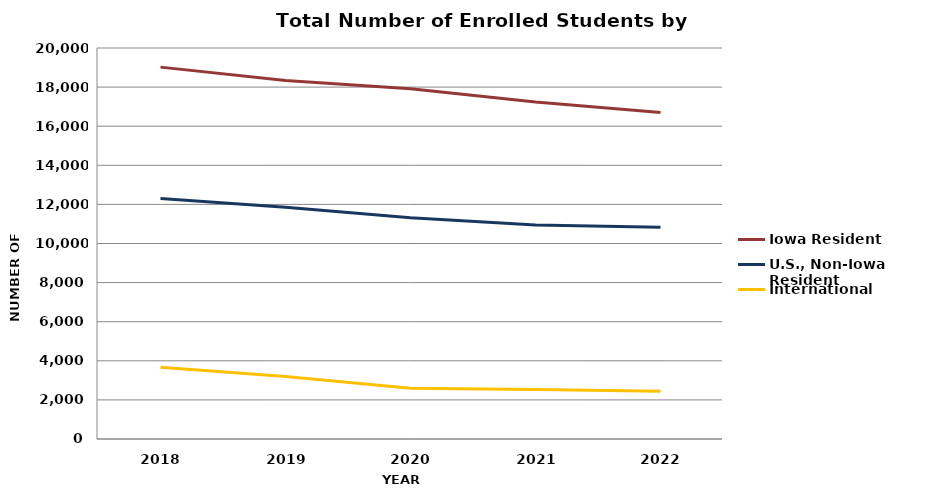
| Category | Iowa Resident | U.S., Non-Iowa Resident | International |
|---|---|---|---|
| 2018.0 | 19022 | 12299 | 3671 |
| 2019.0 | 18341 | 11852 | 3198 |
| 2020.0 | 17911 | 11322 | 2592 |
| 2021.0 | 17232 | 10944 | 2532 |
| 2022.0 | 16696 | 10830 | 2443 |